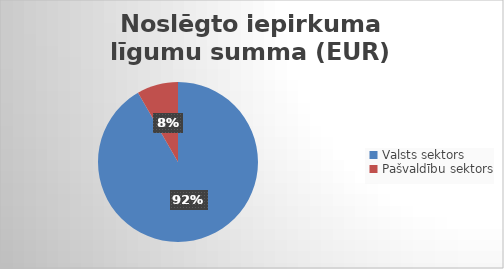
| Category | Noslēgto iepirkuma līgumu summa (EUR) bez PVN |
|---|---|
| Valsts sektors | 148930306 |
| Pašvaldību sektors | 13541735 |